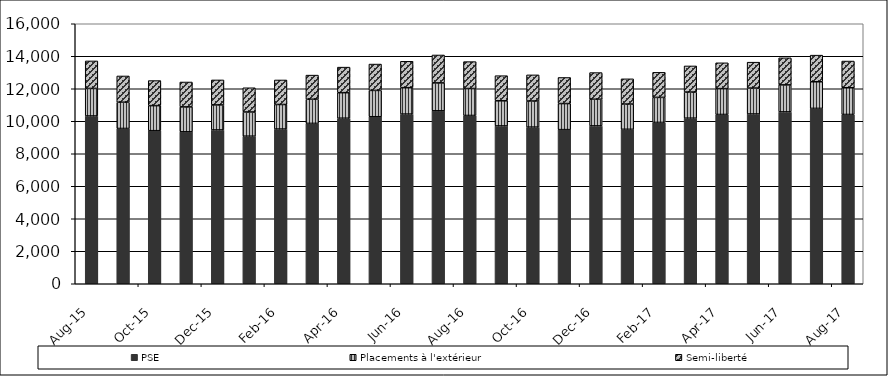
| Category | PSE | Placements à l'extérieur | Semi-liberté |
|---|---|---|---|
| 2015-08-01 | 10325 | 1694 | 1694 |
| 2015-09-01 | 9555 | 1616 | 1616 |
| 2015-10-01 | 9420 | 1542 | 1542 |
| 2015-11-01 | 9350 | 1533 | 1533 |
| 2015-12-01 | 9466 | 1539 | 1539 |
| 2016-01-01 | 9081 | 1490 | 1490 |
| 2016-02-01 | 9521 | 1510 | 1510 |
| 2016-03-01 | 9868 | 1486 | 1486 |
| 2016-04-01 | 10187 | 1572 | 1572 |
| 2016-05-01 | 10278 | 1621 | 1621 |
| 2016-06-01 | 10441 | 1625 | 1625 |
| 2016-07-01 | 10642 | 1718 | 1718 |
| 2016-08-01 | 10355 | 1658 | 1658 |
| 2016-09-01 | 9712 | 1546 | 1546 |
| 2016-10-01 | 9640 | 1607 | 1607 |
| 2016-11-01 | 9484 | 1605 | 1605 |
| 2016-12-01 | 9714 | 1641 | 1641 |
| 2017-01-01 | 9505 | 1553 | 1553 |
| 2017-02-01 | 9927 | 1542 | 1542 |
| 2017-03-01 | 10190 | 1607 | 1607 |
| 2017-04-01 | 10417 | 1590 | 1590 |
| 2017-05-01 | 10448 | 1594 | 1594 |
| 2017-06-01 | 10575 | 1664 | 1664 |
| 2017-07-01 | 10791 | 1639 | 1639 |
| 2017-08-01 | 10417 | 1644 | 1644 |